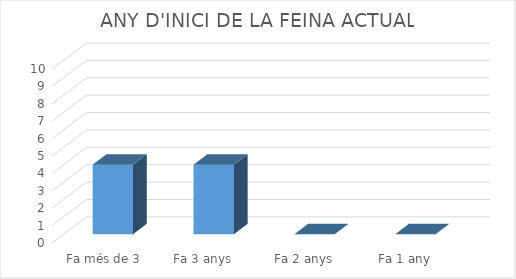
| Category | Series 0 |
|---|---|
| Fa més de 3 anys | 4 |
| Fa 3 anys | 4 |
| Fa 2 anys | 0 |
| Fa 1 any | 0 |